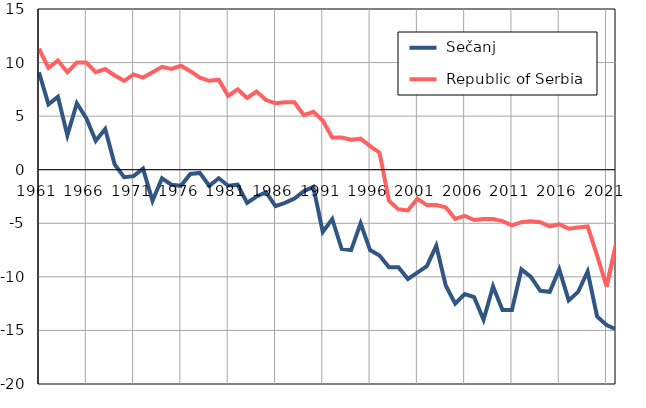
| Category |  Sečanj |  Republic of Serbia |
|---|---|---|
| 1961.0 | 9.1 | 11.3 |
| 1962.0 | 6.1 | 9.5 |
| 1963.0 | 6.8 | 10.2 |
| 1964.0 | 3.2 | 9.1 |
| 1965.0 | 6.2 | 10 |
| 1966.0 | 4.8 | 10 |
| 1967.0 | 2.7 | 9.1 |
| 1968.0 | 3.8 | 9.4 |
| 1969.0 | 0.5 | 8.8 |
| 1970.0 | -0.7 | 8.3 |
| 1971.0 | -0.6 | 8.9 |
| 1972.0 | 0.1 | 8.6 |
| 1973.0 | -2.9 | 9.1 |
| 1974.0 | -0.8 | 9.6 |
| 1975.0 | -1.4 | 9.4 |
| 1976.0 | -1.5 | 9.7 |
| 1977.0 | -0.4 | 9.2 |
| 1978.0 | -0.3 | 8.6 |
| 1979.0 | -1.5 | 8.3 |
| 1980.0 | -0.8 | 8.4 |
| 1981.0 | -1.5 | 6.9 |
| 1982.0 | -1.4 | 7.5 |
| 1983.0 | -3.1 | 6.7 |
| 1984.0 | -2.5 | 7.3 |
| 1985.0 | -2.1 | 6.5 |
| 1986.0 | -3.4 | 6.2 |
| 1987.0 | -3.1 | 6.3 |
| 1988.0 | -2.7 | 6.3 |
| 1989.0 | -2 | 5.1 |
| 1990.0 | -1.6 | 5.4 |
| 1991.0 | -5.8 | 4.6 |
| 1992.0 | -4.6 | 3 |
| 1993.0 | -7.4 | 3 |
| 1994.0 | -7.5 | 2.8 |
| 1995.0 | -5 | 2.9 |
| 1996.0 | -7.5 | 2.2 |
| 1997.0 | -8 | 1.6 |
| 1998.0 | -9.1 | -2.9 |
| 1999.0 | -9.1 | -3.7 |
| 2000.0 | -10.2 | -3.8 |
| 2001.0 | -9.6 | -2.7 |
| 2002.0 | -9 | -3.3 |
| 2003.0 | -7.1 | -3.3 |
| 2004.0 | -10.8 | -3.5 |
| 2005.0 | -12.5 | -4.6 |
| 2006.0 | -11.6 | -4.3 |
| 2007.0 | -11.9 | -4.7 |
| 2008.0 | -14 | -4.6 |
| 2009.0 | -10.9 | -4.6 |
| 2010.0 | -13.1 | -4.8 |
| 2011.0 | -13.1 | -5.2 |
| 2012.0 | -9.3 | -4.9 |
| 2013.0 | -10 | -4.8 |
| 2014.0 | -11.3 | -4.9 |
| 2015.0 | -11.4 | -5.3 |
| 2016.0 | -9.3 | -5.1 |
| 2017.0 | -12.2 | -5.5 |
| 2018.0 | -11.4 | -5.4 |
| 2019.0 | -9.5 | -5.3 |
| 2020.0 | -13.7 | -8 |
| 2021.0 | -14.5 | -10.9 |
| 2022.0 | -14.9 | -7 |